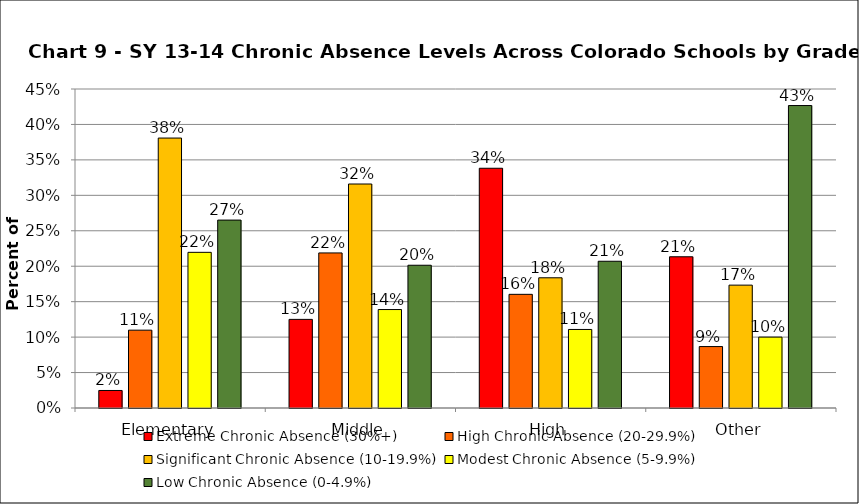
| Category | Extreme Chronic Absence (30%+) | High Chronic Absence (20-29.9%) | Significant Chronic Absence (10-19.9%) | Modest Chronic Absence (5-9.9%) | Low Chronic Absence (0-4.9%) |
|---|---|---|---|---|---|
| 0 | 0.025 | 0.11 | 0.381 | 0.22 | 0.265 |
| 1 | 0.125 | 0.219 | 0.316 | 0.139 | 0.201 |
| 2 | 0.338 | 0.16 | 0.184 | 0.111 | 0.207 |
| 3 | 0.213 | 0.087 | 0.173 | 0.1 | 0.427 |